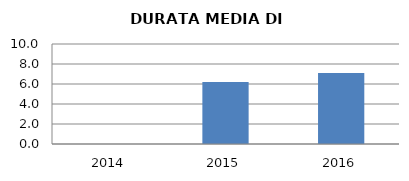
| Category | 2014 2015 2016 |
|---|---|
| 2014.0 | 0 |
| 2015.0 | 6.2 |
| 2016.0 | 7.111 |